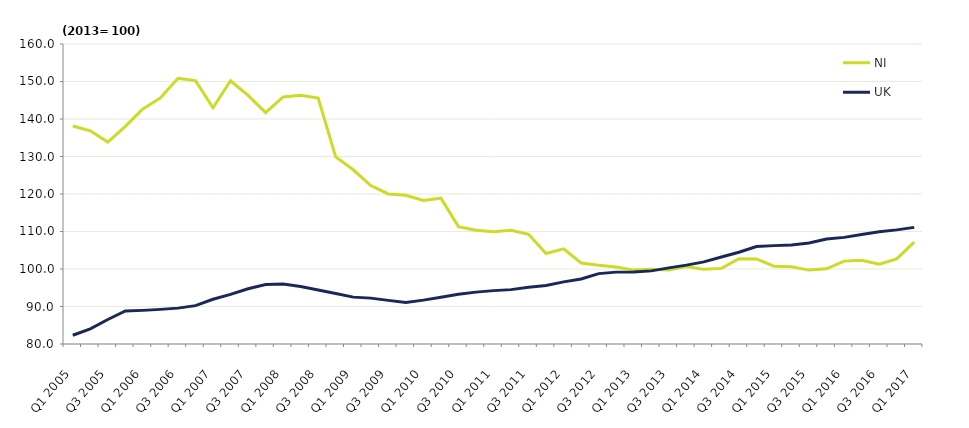
| Category | NI | UK |
|---|---|---|
| Q1 2005 | 138.138 | 82.333 |
| Q2 2005 | 136.863 | 84.033 |
| Q3 2005 | 133.864 | 86.533 |
| Q4 2005 | 138.049 | 88.8 |
| Q1 2006 | 142.687 | 88.967 |
| Q2 2006 | 145.624 | 89.233 |
| Q3 2006 | 150.869 | 89.567 |
| Q4 2006 | 150.25 | 90.233 |
| Q1 2007 | 143.001 | 91.933 |
| Q2 2007 | 150.194 | 93.233 |
| Q3 2007 | 146.301 | 94.733 |
| Q4 2007 | 141.709 | 95.867 |
| Q1 2008 | 145.884 | 95.967 |
| Q2 2008 | 146.328 | 95.333 |
| Q3 2008 | 145.596 | 94.4 |
| Q4 2008 | 129.889 | 93.467 |
| Q1 2009 | 126.463 | 92.5 |
| Q2 2009 | 122.25 | 92.233 |
| Q3 2009 | 120.02 | 91.633 |
| Q4 2009 | 119.66 | 91.067 |
| Q1 2010 | 118.297 | 91.7 |
| Q2 2010 | 118.874 | 92.467 |
| Q3 2010 | 111.297 | 93.267 |
| Q4 2010 | 110.328 | 93.833 |
| Q1 2011 | 109.905 | 94.233 |
| Q2 2011 | 110.356 | 94.5 |
| Q3 2011 | 109.256 | 95.133 |
| Q4 2011 | 104.12 | 95.6 |
| Q1 2012 | 105.362 | 96.567 |
| Q2 2012 | 101.61 | 97.333 |
| Q3 2012 | 100.999 | 98.767 |
| Q4 2012 | 100.505 | 99.167 |
| Q1 2013 | 99.703 | 99.2 |
| Q2 2013 | 99.93 | 99.5 |
| Q3 2013 | 99.729 | 100.3 |
| Q4 2013 | 100.638 | 101.033 |
| Q1 2014 | 99.904 | 101.9 |
| Q2 2014 | 100.166 | 103.2 |
| Q3 2014 | 102.718 | 104.467 |
| Q4 2014 | 102.673 | 106 |
| Q1 2015 | 100.76 | 106.233 |
| Q2 2015 | 100.593 | 106.4 |
| Q3 2015 | 99.703 | 106.933 |
| Q4 2015 | 100.064 | 108 |
| Q1 2016 | 102.1 | 108.433 |
| Q2 2016 | 102.34 | 109.2 |
| Q3 2016 | 101.295 | 109.933 |
| Q4 2016 | 102.692 | 110.433 |
| Q1 2017 | 107.172 | 111.1 |